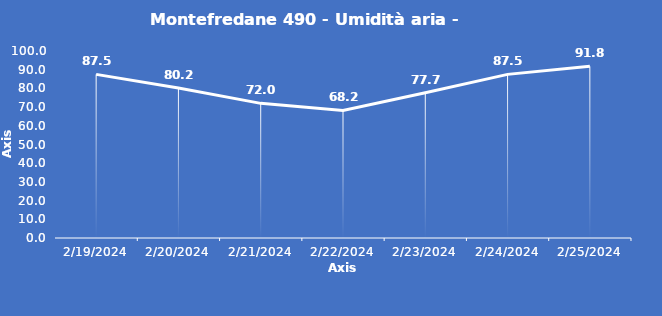
| Category | Montefredane 490 - Umidità aria - Grezzo (%) |
|---|---|
| 2/19/24 | 87.5 |
| 2/20/24 | 80.2 |
| 2/21/24 | 72 |
| 2/22/24 | 68.2 |
| 2/23/24 | 77.7 |
| 2/24/24 | 87.5 |
| 2/25/24 | 91.8 |